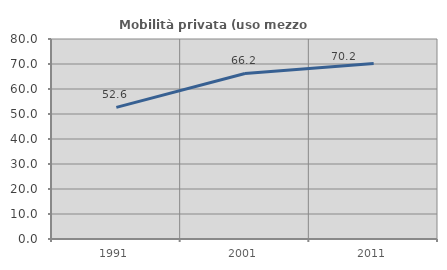
| Category | Mobilità privata (uso mezzo privato) |
|---|---|
| 1991.0 | 52.638 |
| 2001.0 | 66.221 |
| 2011.0 | 70.186 |